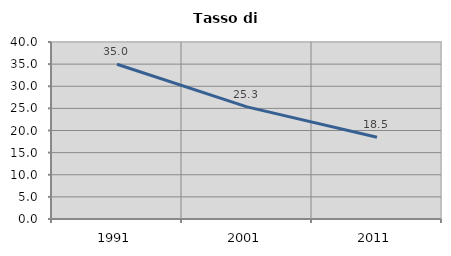
| Category | Tasso di disoccupazione   |
|---|---|
| 1991.0 | 34.98 |
| 2001.0 | 25.347 |
| 2011.0 | 18.494 |